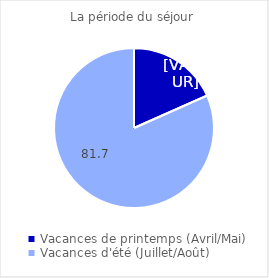
| Category | Series 0 |
|---|---|
| Vacances de printemps (Avril/Mai) | 18.349 |
| Vacances d'été (Juillet/Août) | 81.651 |